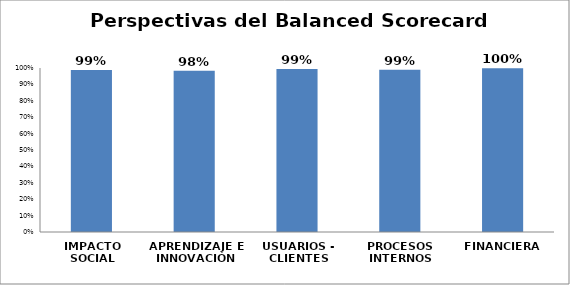
| Category | Series 0 |
|---|---|
| IMPACTO SOCIAL | 0.987 |
| APRENDIZAJE E INNOVACIÓN | 0.984 |
| USUARIOS - CLIENTES | 0.994 |
| PROCESOS INTERNOS | 0.989 |
| FINANCIERA | 0.999 |